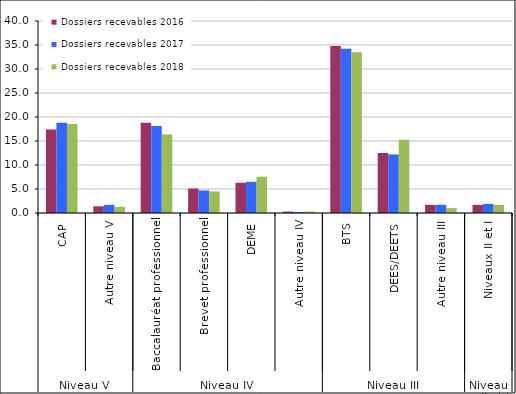
| Category | Dossiers recevables 2016 | Dossiers recevables 2017 | Dossiers recevables 2018 |
|---|---|---|---|
| 0 | 17.4 | 18.8 | 18.55 |
| 1 | 1.4 | 1.7 | 1.3 |
| 2 | 18.8 | 18.1 | 16.37 |
| 3 | 5.1 | 4.7 | 4.49 |
| 4 | 6.3 | 6.5 | 7.56 |
| 5 | 0.3 | 0.2 | 0.27 |
| 6 | 34.8 | 34.2 | 33.51 |
| 7 | 12.5 | 12.2 | 15.26 |
| 8 | 1.7 | 1.7 | 1.01 |
| 9 | 1.7 | 1.9 | 1.68 |